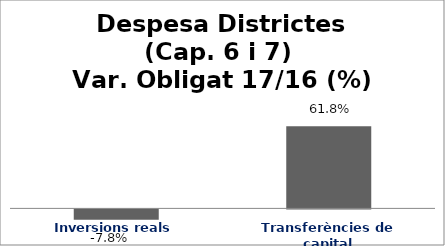
| Category | Series 0 |
|---|---|
| Inversions reals | -0.078 |
| Transferències de capital | 0.618 |